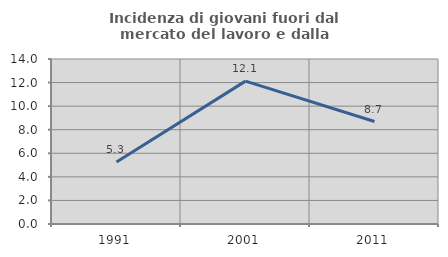
| Category | Incidenza di giovani fuori dal mercato del lavoro e dalla formazione  |
|---|---|
| 1991.0 | 5.263 |
| 2001.0 | 12.121 |
| 2011.0 | 8.696 |